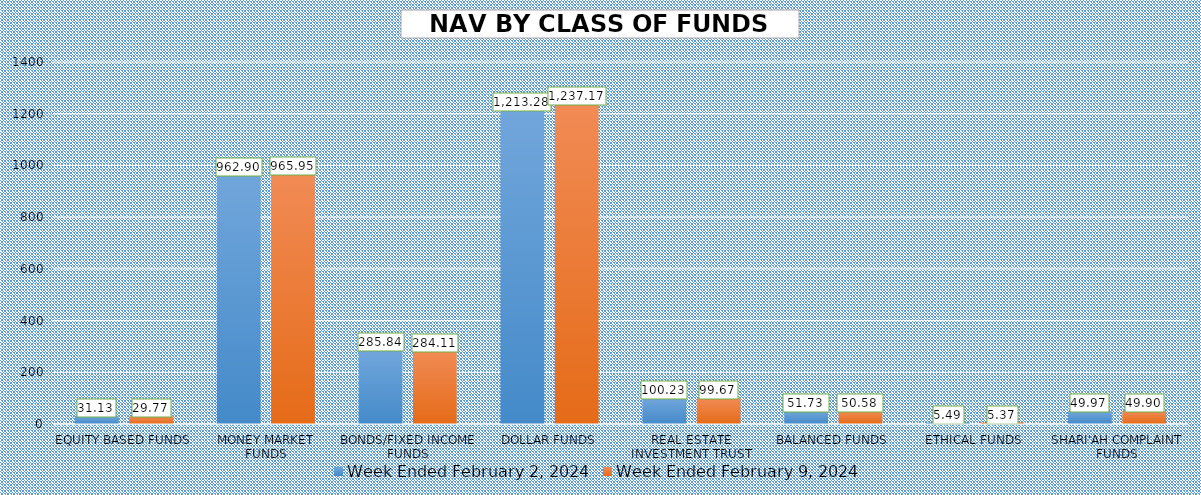
| Category | Week Ended February 2, 2024 | Week Ended February 9, 2024 |
|---|---|---|
| EQUITY BASED FUNDS | 31.133 | 29.773 |
| MONEY MARKET FUNDS | 962.897 | 965.954 |
| BONDS/FIXED INCOME FUNDS | 285.837 | 284.11 |
| DOLLAR FUNDS | 1213.278 | 1237.173 |
| REAL ESTATE INVESTMENT TRUST | 100.226 | 99.672 |
| BALANCED FUNDS | 51.726 | 50.58 |
| ETHICAL FUNDS | 5.492 | 5.372 |
| SHARI'AH COMPLAINT FUNDS | 49.969 | 49.899 |